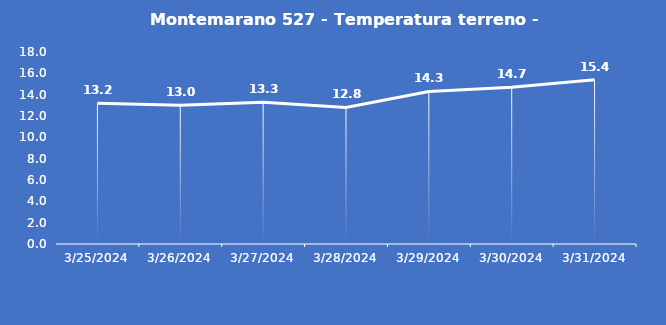
| Category | Montemarano 527 - Temperatura terreno - Grezzo (°C) |
|---|---|
| 3/25/24 | 13.2 |
| 3/26/24 | 13 |
| 3/27/24 | 13.3 |
| 3/28/24 | 12.8 |
| 3/29/24 | 14.3 |
| 3/30/24 | 14.7 |
| 3/31/24 | 15.4 |